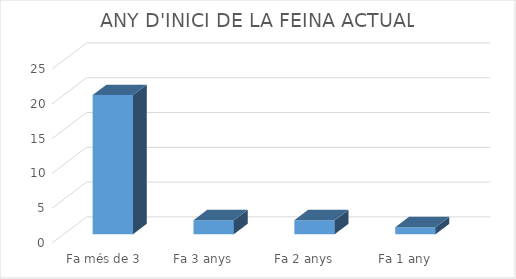
| Category | Series 0 |
|---|---|
| Fa més de 3 anys | 20 |
| Fa 3 anys | 2 |
| Fa 2 anys | 2 |
| Fa 1 any | 1 |